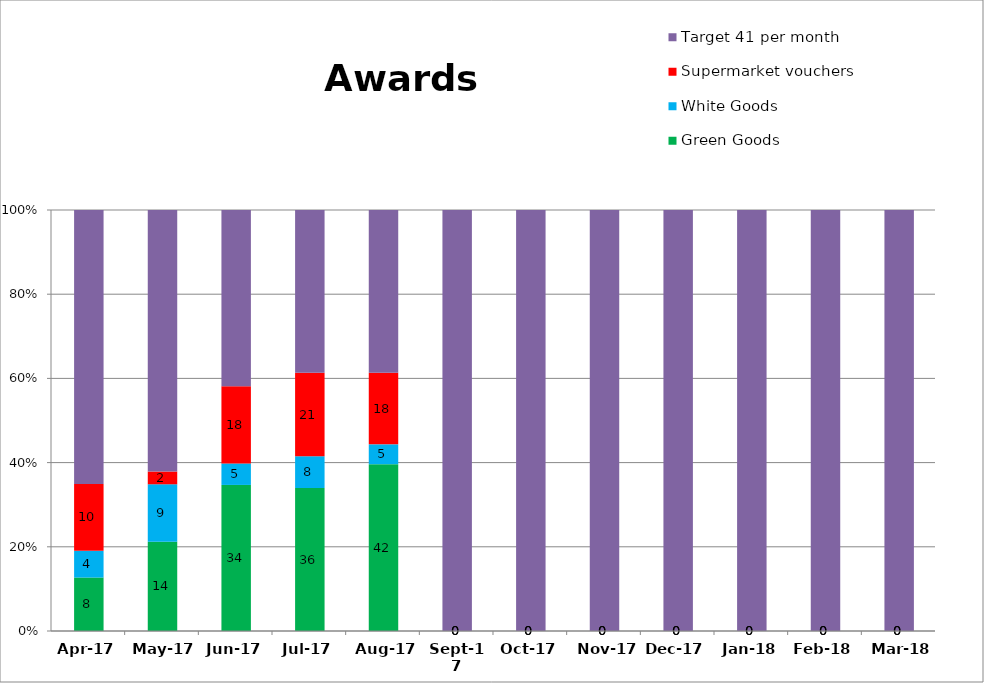
| Category | Green Goods | White Goods | Supermarket vouchers | Target 41 per month |
|---|---|---|---|---|
| 2017-04-01 | 8 | 4 | 10 | 41 |
| 2017-05-01 | 14 | 9 | 2 | 41 |
| 2017-06-01 | 34 | 5 | 18 | 41 |
| 2017-07-01 | 36 | 8 | 21 | 41 |
| 2017-08-01 | 42 | 5 | 18 | 41 |
| 2017-09-01 | 0 | 0 | 0 | 41 |
| 2017-10-01 | 0 | 0 | 0 | 41 |
| 2017-11-01 | 0 | 0 | 0 | 41 |
| 2017-12-01 | 0 | 0 | 0 | 41 |
| 2018-01-01 | 0 | 0 | 0 | 41 |
| 2018-02-01 | 0 | 0 | 0 | 41 |
| 2018-03-01 | 0 | 0 | 0 | 41 |